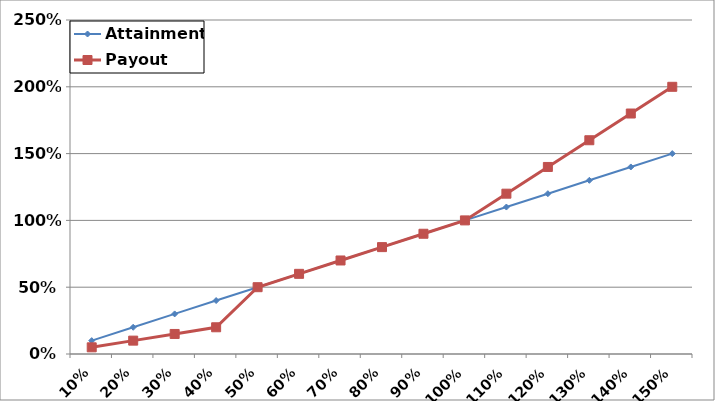
| Category | Attainment | Payout |
|---|---|---|
| 10% | 0.1 | 0.05 |
| 20% | 0.2 | 0.1 |
| 30% | 0.3 | 0.15 |
| 40% | 0.4 | 0.2 |
| 50% | 0.5 | 0.5 |
| 60% | 0.6 | 0.6 |
| 70% | 0.7 | 0.7 |
| 80% | 0.8 | 0.8 |
| 90% | 0.9 | 0.9 |
| 100% | 1 | 1 |
| 110% | 1.1 | 1.2 |
| 120% | 1.2 | 1.4 |
| 130% | 1.3 | 1.6 |
| 140% | 1.4 | 1.8 |
| 150% | 1.5 | 2 |